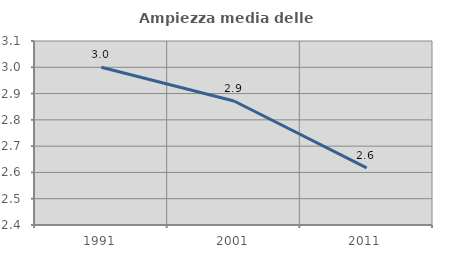
| Category | Ampiezza media delle famiglie |
|---|---|
| 1991.0 | 3 |
| 2001.0 | 2.872 |
| 2011.0 | 2.617 |